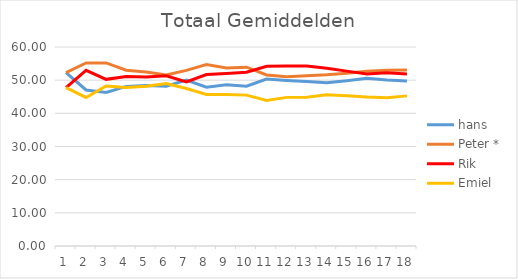
| Category | hans | Peter *  | Rik   | Emiel |
|---|---|---|---|---|
| 0 | 52.25 | 52.25 | 47.75 | 47.75 |
| 1 | 47.04 | 55.21 | 52.96 | 44.79 |
| 2 | 46.303 | 55.197 | 50.25 | 48.25 |
| 3 | 48.122 | 53.002 | 51.082 | 47.793 |
| 4 | 48.414 | 52.486 | 50.95 | 48.15 |
| 5 | 48.165 | 51.558 | 51.305 | 48.972 |
| 6 | 50.046 | 52.954 | 49.5 | 47.5 |
| 7 | 47.894 | 54.731 | 51.709 | 45.666 |
| 8 | 48.628 | 53.706 | 52.019 | 45.648 |
| 9 | 48.173 | 53.927 | 52.409 | 45.491 |
| 10 | 50.339 | 51.57 | 54.19 | 43.901 |
| 11 | 49.908 | 51.037 | 54.243 | 44.812 |
| 12 | 49.563 | 51.309 | 54.269 | 44.858 |
| 13 | 49.196 | 51.614 | 53.566 | 45.624 |
| 14 | 49.849 | 52.107 | 52.728 | 45.316 |
| 15 | 50.557 | 52.673 | 51.859 | 44.911 |
| 16 | 50.034 | 53.006 | 52.24 | 44.72 |
| 17 | 49.782 | 53.089 | 51.866 | 45.263 |